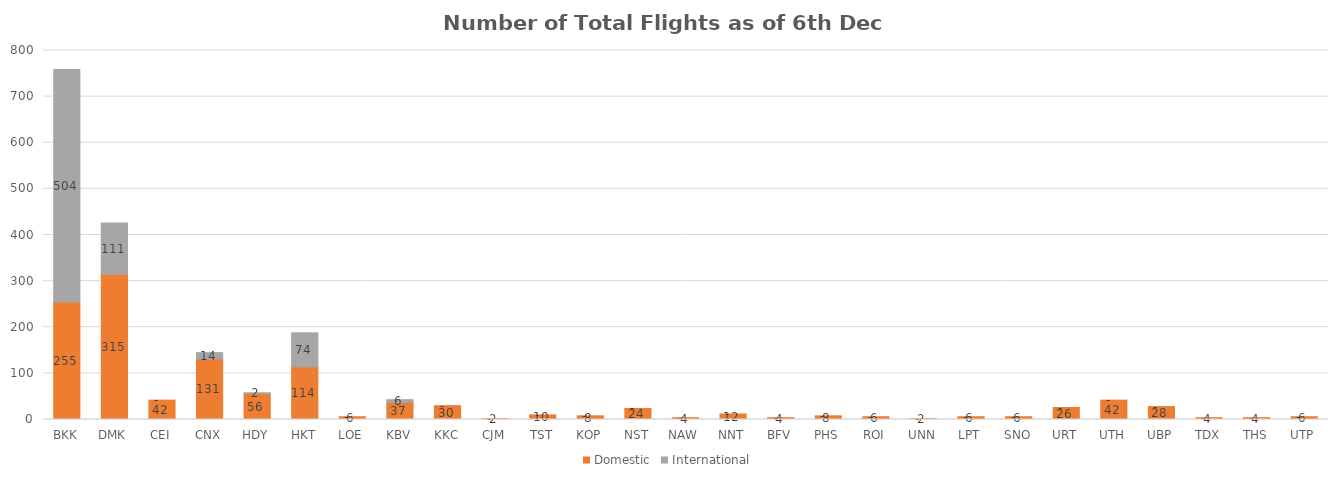
| Category | Domestic | International |
|---|---|---|
| BKK | 255 | 504 |
| DMK | 315 | 111 |
| CEI | 42 | 0 |
| CNX | 131 | 14 |
| HDY | 56 | 2 |
| HKT | 114 | 74 |
| LOE | 6 | 0 |
| KBV | 37 | 6 |
| KKC | 30 | 0 |
| CJM | 2 | 0 |
| TST | 10 | 0 |
| KOP | 8 | 0 |
| NST | 24 | 0 |
| NAW | 4 | 0 |
| NNT | 12 | 0 |
| BFV | 4 | 0 |
| PHS | 8 | 0 |
| ROI | 6 | 0 |
| UNN | 2 | 0 |
| LPT | 6 | 0 |
| SNO | 6 | 0 |
| URT | 26 | 0 |
| UTH | 42 | 0 |
| UBP | 28 | 0 |
| TDX | 4 | 0 |
| THS | 4 | 0 |
| UTP | 6 | 0 |